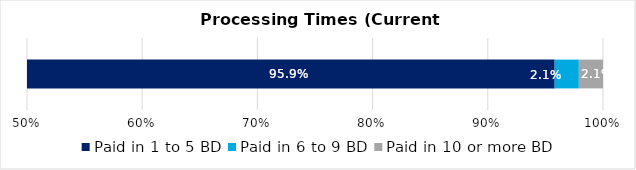
| Category | Paid in 1 to 5 BD | Paid in 6 to 9 BD | Paid in 10 or more BD |
|---|---|---|---|
| 0 | 0.959 | 0.021 | 0.021 |